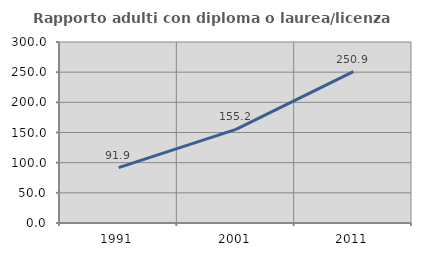
| Category | Rapporto adulti con diploma o laurea/licenza media  |
|---|---|
| 1991.0 | 91.879 |
| 2001.0 | 155.192 |
| 2011.0 | 250.855 |